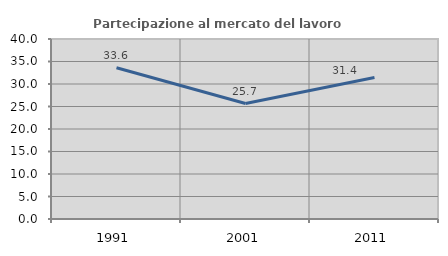
| Category | Partecipazione al mercato del lavoro  femminile |
|---|---|
| 1991.0 | 33.608 |
| 2001.0 | 25.664 |
| 2011.0 | 31.45 |